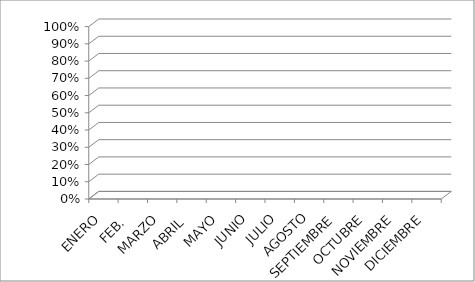
| Category | Series 0 |
|---|---|
| ENERO  | 0 |
| FEB.  | 0 |
| MARZO | 0 |
| ABRIL  | 0 |
| MAYO | 0 |
| JUNIO | 0 |
| JULIO | 0 |
| AGOSTO | 0 |
| SEPTIEMBRE | 0 |
| OCTUBRE | 0 |
| NOVIEMBRE | 0 |
| DICIEMBRE | 0 |